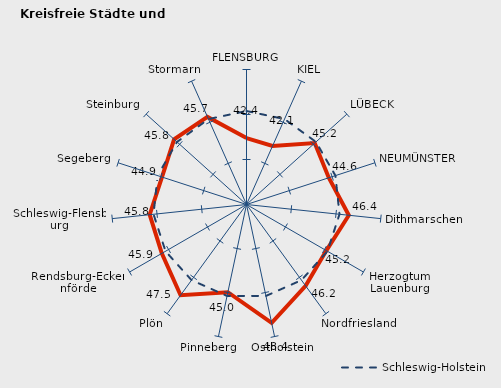
| Category | Kreise | Schleswig-Holstein |
|---|---|---|
| FLENSBURG | 42.378 | 45.388 |
| KIEL | 42.117 | 45.388 |
| LÜBECK | 45.196 | 45.388 |
| NEUMÜNSTER | 44.613 | 45.388 |
| Dithmarschen | 46.432 | 45.388 |
| Herzogtum Lauenburg | 45.242 | 45.388 |
| Nordfriesland | 46.177 | 45.388 |
| Ostholstein | 48.445 | 45.388 |
| Pinneberg | 44.958 | 45.388 |
| Plön | 47.464 | 45.388 |
| Rendsburg-Eckernförde | 45.868 | 45.388 |
| Schleswig-Flensburg | 45.817 | 45.388 |
| Segeberg | 44.875 | 45.388 |
| Steinburg | 45.823 | 45.388 |
| Stormarn | 45.656 | 45.388 |